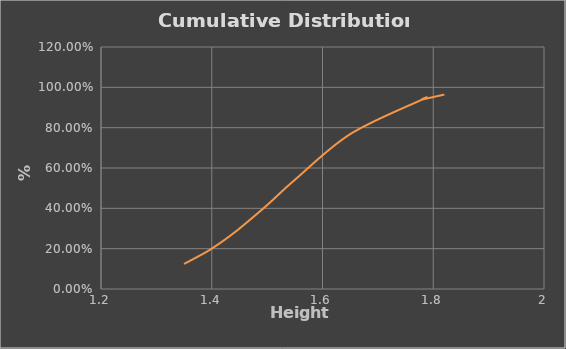
| Category | Cumulative Distribution % |
|---|---|
| 1.35 | 0.124 |
| 1.39 | 0.183 |
| 1.41 | 0.219 |
| 1.42 | 0.238 |
| 1.43 | 0.257 |
| 1.44 | 0.278 |
| 1.45 | 0.3 |
| 1.49 | 0.392 |
| 1.51 | 0.441 |
| 1.55 | 0.541 |
| 1.65 | 0.768 |
| 1.78 | 0.939 |
| 1.78 | 0.939 |
| 1.82 | 0.964 |